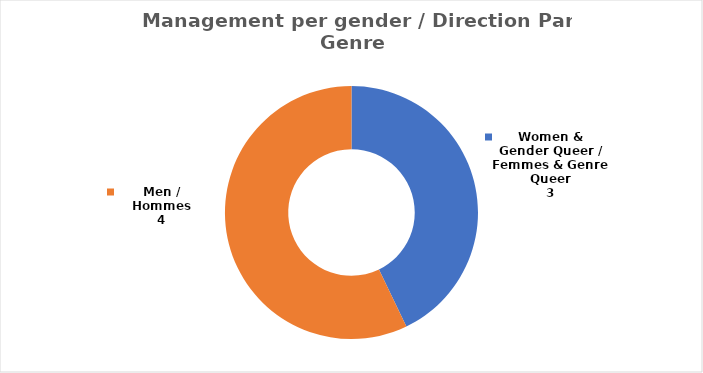
| Category | Series 0 |
|---|---|
| Women & Gender Queer / Femmes & Genre Queer | 3 |
| Men / Hommes | 4 |